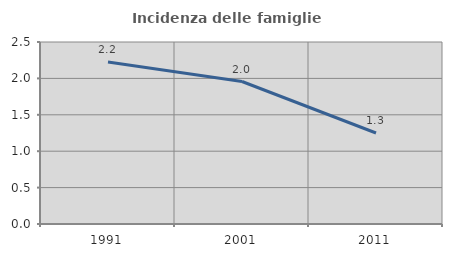
| Category | Incidenza delle famiglie numerose |
|---|---|
| 1991.0 | 2.225 |
| 2001.0 | 1.957 |
| 2011.0 | 1.25 |